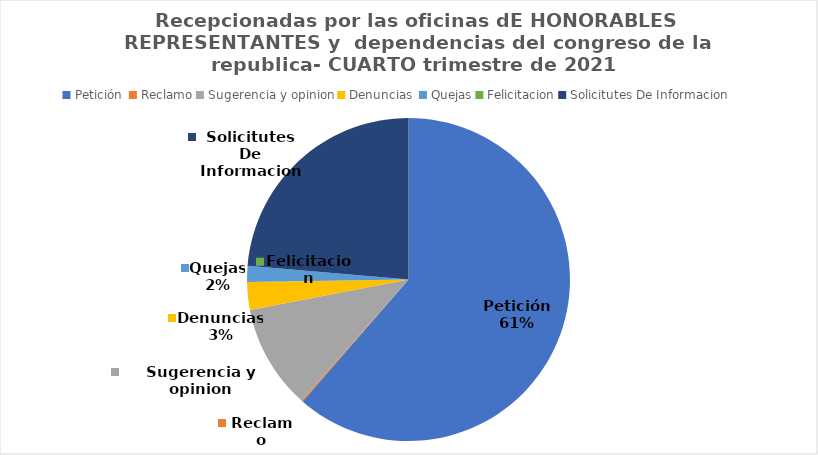
| Category | Series 0 |
|---|---|
| Petición  | 841 |
| Reclamo | 2 |
| Sugerencia y opinion | 143 |
| Denuncias  | 38 |
| Quejas | 22 |
| Felicitacion | 0 |
| Solicitutes De Informacion | 324 |